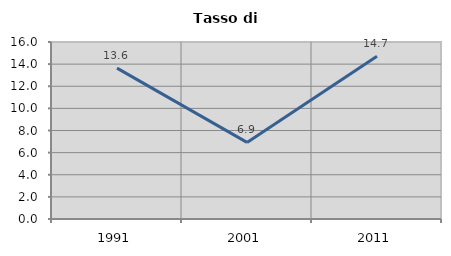
| Category | Tasso di disoccupazione   |
|---|---|
| 1991.0 | 13.636 |
| 2001.0 | 6.923 |
| 2011.0 | 14.706 |